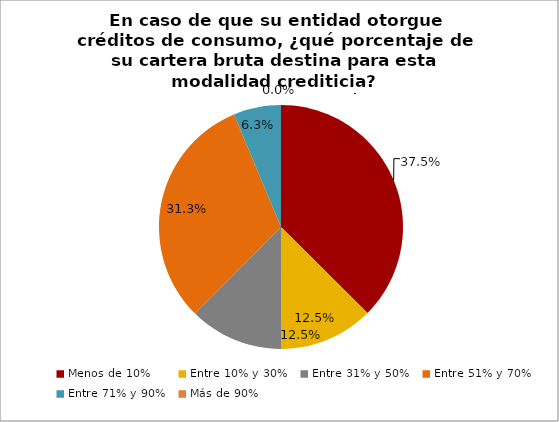
| Category | En caso de que su entidad otorgue créditos de consumo, ¿qué porcentaje de su cartera bruta destina para esta modalidad crediticia? Mercado de microcrédito |
|---|---|
| Menos de 10% | 0.375 |
| Entre 10% y 30% | 0.125 |
| Entre 31% y 50% | 0.125 |
| Entre 51% y 70% | 0.313 |
| Entre 71% y 90% | 0.063 |
| Más de 90% | 0 |